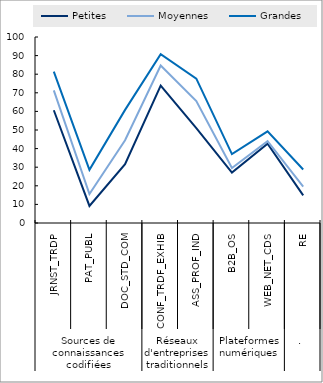
| Category | Petites | Moyennes | Grandes |
|---|---|---|---|
| 0 | 60.624 | 71.318 | 81.412 |
| 1 | 9.171 | 15.525 | 28.6 |
| 2 | 31.671 | 44.5 | 60.812 |
| 3 | 73.853 | 84.706 | 90.724 |
| 4 | 50.975 | 65.588 | 77.594 |
| 5 | 27.118 | 29.582 | 37.047 |
| 6 | 42.641 | 43.994 | 49.3 |
| 7 | 14.847 | 19.576 | 28.741 |